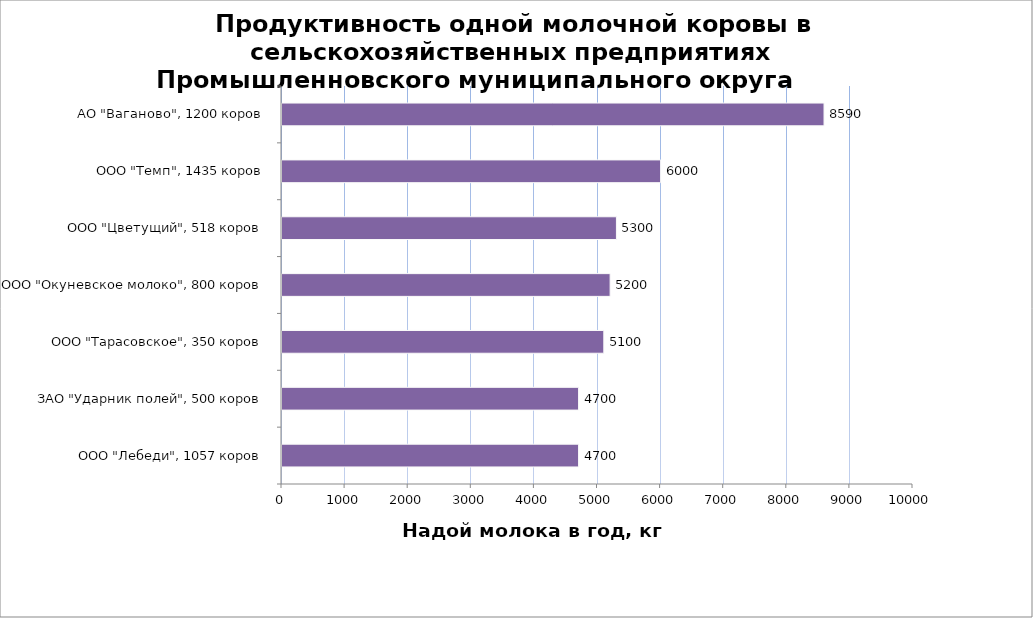
| Category | Series 0 |
|---|---|
| ООО "Лебеди", 1057 коров | 4700 |
| ЗАО "Ударник полей", 500 коров | 4700 |
| ООО "Тарасовское", 350 коров | 5100 |
| ООО "Окуневское молоко", 800 коров | 5200 |
| ООО "Цветущий", 518 коров | 5300 |
| ООО "Темп", 1435 коров | 6000 |
| АО "Ваганово", 1200 коров | 8590 |